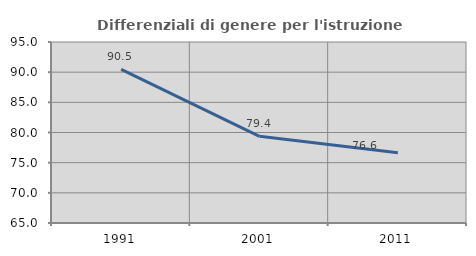
| Category | Differenziali di genere per l'istruzione superiore |
|---|---|
| 1991.0 | 90.455 |
| 2001.0 | 79.361 |
| 2011.0 | 76.628 |